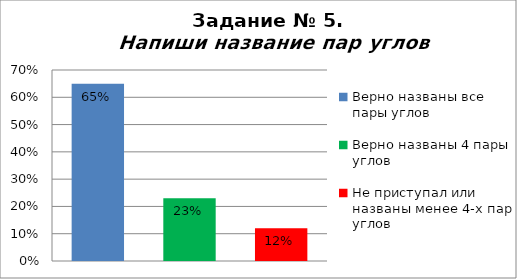
| Category | Напиши название пар углов |
|---|---|
| Верно названы все пары углов | 0.65 |
| Верно названы 4 пары углов | 0.23 |
| Не приступал или названы менее 4-х пар углов | 0.12 |